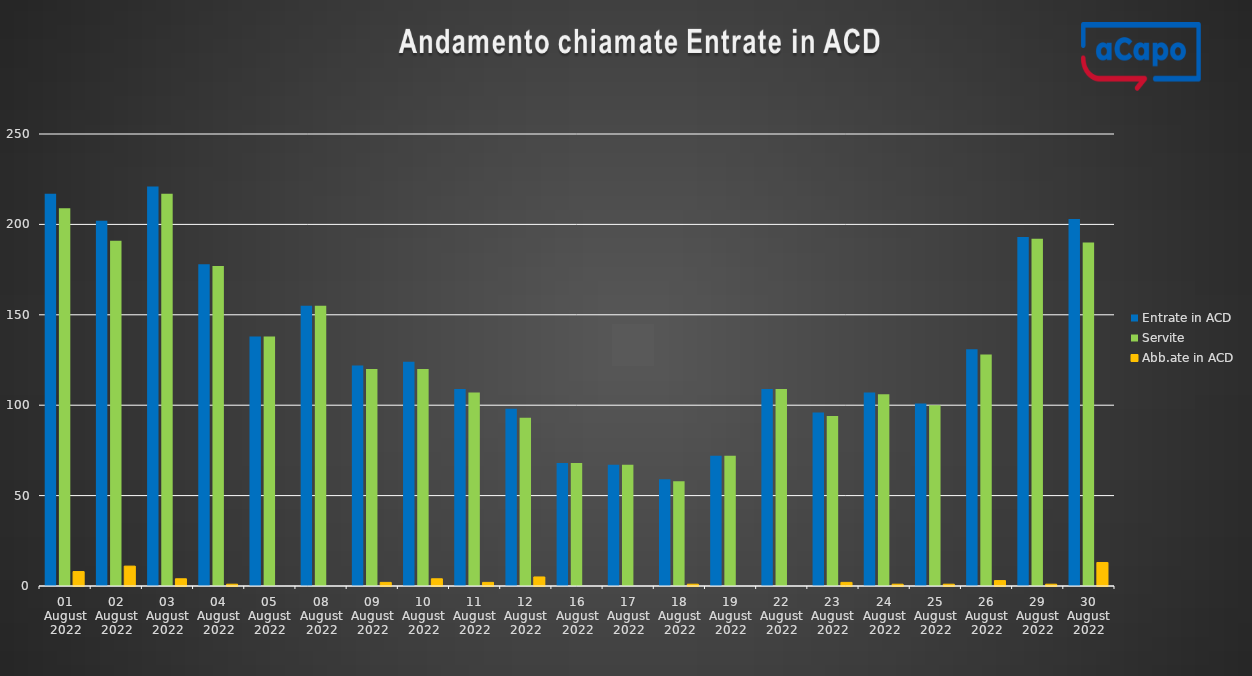
| Category | Entrate in ACD | Servite | Abb.ate in ACD |
|---|---|---|---|
| 2022-08-01 | 217 | 209 | 8 |
| 2022-08-02 | 202 | 191 | 11 |
| 2022-08-03 | 221 | 217 | 4 |
| 2022-08-04 | 178 | 177 | 1 |
| 2022-08-05 | 138 | 138 | 0 |
| 2022-08-08 | 155 | 155 | 0 |
| 2022-08-09 | 122 | 120 | 2 |
| 2022-08-10 | 124 | 120 | 4 |
| 2022-08-11 | 109 | 107 | 2 |
| 2022-08-12 | 98 | 93 | 5 |
| 2022-08-16 | 68 | 68 | 0 |
| 2022-08-17 | 67 | 67 | 0 |
| 2022-08-18 | 59 | 58 | 1 |
| 2022-08-19 | 72 | 72 | 0 |
| 2022-08-22 | 109 | 109 | 0 |
| 2022-08-23 | 96 | 94 | 2 |
| 2022-08-24 | 107 | 106 | 1 |
| 2022-08-25 | 101 | 100 | 1 |
| 2022-08-26 | 131 | 128 | 3 |
| 2022-08-29 | 193 | 192 | 1 |
| 2022-08-30 | 203 | 190 | 13 |